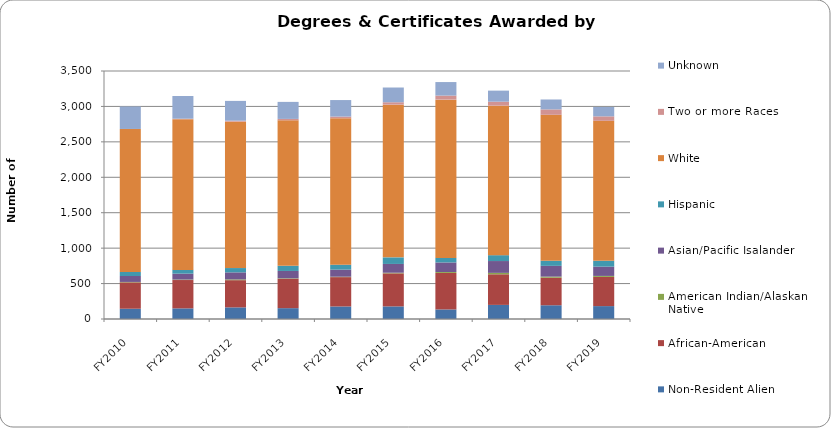
| Category | Non-Resident Alien | African-American | American Indian/Alaskan Native | Asian/Pacific Isalander | Hispanic | White | Two or more Races | Unknown |
|---|---|---|---|---|---|---|---|---|
| FY2010 | 145 | 372 | 6 | 84 | 56 | 2018 | 1 | 317 |
| FY2011 | 150 | 400 | 7 | 83 | 53 | 2127 | 7 | 320 |
| FY2012 | 164 | 384 | 11 | 99 | 61 | 2066 | 14 | 279 |
| FY2013 | 153 | 414 | 7 | 104 | 73 | 2053 | 20 | 240 |
| FY2014 | 177 | 414 | 6 | 100 | 69 | 2068 | 23 | 233 |
| FY2015 | 178 | 466 | 9 | 124 | 93 | 2155 | 34 | 208 |
| FY2016 | 135 | 515 | 13 | 135 | 64 | 2234 | 57 | 191 |
| FY2017 | 199 | 432 | 20 | 167 | 83 | 2110 | 56 | 156 |
| FY2018 | 194 | 389 | 15 | 152 | 72 | 2060 | 76 | 140 |
| FY2019 | 182 | 412 | 14 | 131 | 83 | 1975 | 63 | 133 |